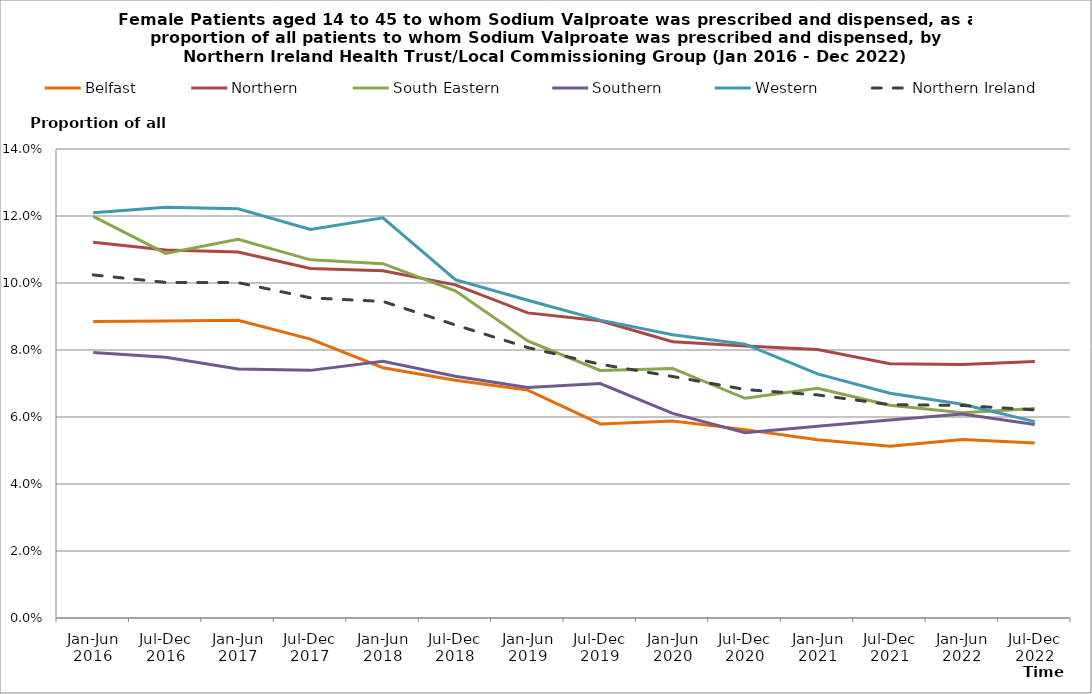
| Category | Belfast | Northern | South Eastern | Southern | Western | Northern Ireland |
|---|---|---|---|---|---|---|
| Jan-Jun 2016 | 0.089 | 0.112 | 0.12 | 0.079 | 0.121 | 0.102 |
| Jul-Dec 2016 | 0.089 | 0.11 | 0.109 | 0.078 | 0.123 | 0.1 |
| Jan-Jun 2017 | 0.089 | 0.109 | 0.113 | 0.074 | 0.122 | 0.1 |
| Jul-Dec 2017 | 0.083 | 0.104 | 0.107 | 0.074 | 0.116 | 0.096 |
| Jan-Jun 2018 | 0.075 | 0.104 | 0.106 | 0.077 | 0.119 | 0.094 |
| Jul-Dec 2018 | 0.071 | 0.099 | 0.098 | 0.072 | 0.101 | 0.087 |
| Jan-Jun 2019 | 0.068 | 0.091 | 0.083 | 0.069 | 0.095 | 0.081 |
| Jul-Dec 2019 | 0.058 | 0.089 | 0.074 | 0.07 | 0.089 | 0.076 |
| Jan-Jun 2020 | 0.059 | 0.082 | 0.075 | 0.061 | 0.085 | 0.072 |
| Jul-Dec 2020 | 0.056 | 0.081 | 0.066 | 0.055 | 0.082 | 0.068 |
| Jan-Jun 2021 | 0.053 | 0.08 | 0.069 | 0.057 | 0.073 | 0.067 |
| Jul-Dec 2021 | 0.051 | 0.076 | 0.064 | 0.059 | 0.067 | 0.064 |
| Jan-Jun 2022 | 0.053 | 0.076 | 0.061 | 0.061 | 0.064 | 0.063 |
| Jul-Dec 2022 | 0.052 | 0.077 | 0.063 | 0.058 | 0.059 | 0.062 |